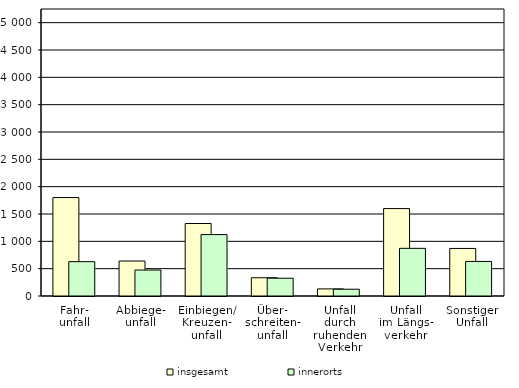
| Category |    insgesamt |    innerorts |
|---|---|---|
| 0 | 1801 | 628 |
| 1 | 640 | 475 |
| 2 | 1326 | 1123 |
| 3 | 334 | 325 |
| 4 | 130 | 124 |
| 5 | 1599 | 872 |
| 6 | 870 | 632 |